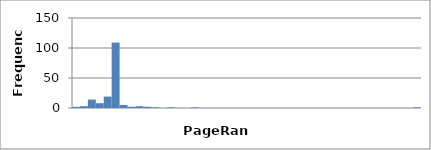
| Category | 2 |
|---|---|
| 0.0 | 2 |
| 0.023255813953488372 | 3 |
| 0.046511627906976744 | 14 |
| 0.06976744186046512 | 8 |
| 0.09302325581395349 | 19 |
| 0.11627906976744186 | 109 |
| 0.13953488372093023 | 5 |
| 0.16279069767441862 | 2 |
| 0.18604651162790697 | 3 |
| 0.20930232558139533 | 2 |
| 0.2325581395348837 | 1 |
| 0.25581395348837205 | 0 |
| 0.2790697674418604 | 1 |
| 0.30232558139534876 | 0 |
| 0.3255813953488371 | 0 |
| 0.3488372093023255 | 1 |
| 0.37209302325581384 | 0 |
| 0.3953488372093022 | 0 |
| 0.41860465116279055 | 0 |
| 0.4418604651162789 | 0 |
| 0.46511627906976727 | 0 |
| 0.4883720930232556 | 0 |
| 0.511627906976744 | 0 |
| 0.5348837209302324 | 0 |
| 0.5581395348837208 | 0 |
| 0.5813953488372092 | 0 |
| 0.6046511627906976 | 0 |
| 0.627906976744186 | 0 |
| 0.6511627906976745 | 0 |
| 0.6744186046511629 | 0 |
| 0.6976744186046513 | 0 |
| 0.7209302325581397 | 0 |
| 0.7441860465116281 | 0 |
| 0.7674418604651165 | 0 |
| 0.790697674418605 | 0 |
| 0.8139534883720934 | 0 |
| 0.8372093023255818 | 0 |
| 0.8604651162790702 | 0 |
| 0.8837209302325586 | 0 |
| 0.906976744186047 | 0 |
| 0.9302325581395354 | 0 |
| 0.9534883720930238 | 0 |
| 0.9767441860465123 | 0 |
| 1.0 | 1 |